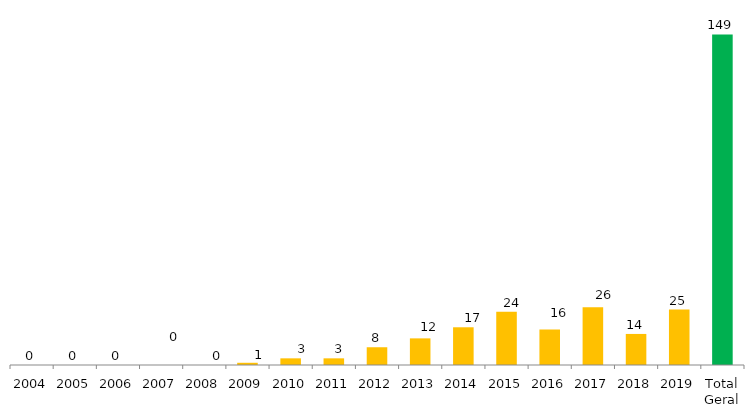
| Category | Categoria/Ano |
|---|---|
| 2004 | 0 |
| 2005 | 0 |
| 2006 | 0 |
| 2007 | 0 |
| 2008 | 0 |
| 2009 | 1 |
| 2010 | 3 |
| 2011 | 3 |
| 2012 | 8 |
| 2013 | 12 |
| 2014 | 17 |
| 2015 | 24 |
| 2016 | 16 |
| 2017 | 26 |
| 2018 | 14 |
| 2019 | 25 |
| Total Geral | 149 |